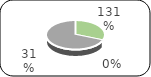
| Category | Series 0 |
|---|---|
| 0 | 2897219.74 |
| 1 | 0 |
| 2 | -688551.92 |